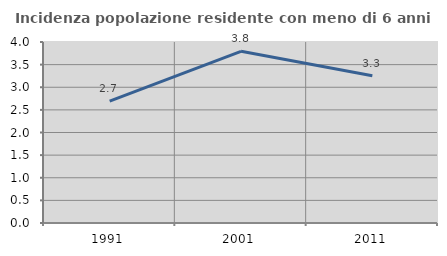
| Category | Incidenza popolazione residente con meno di 6 anni |
|---|---|
| 1991.0 | 2.695 |
| 2001.0 | 3.794 |
| 2011.0 | 3.256 |